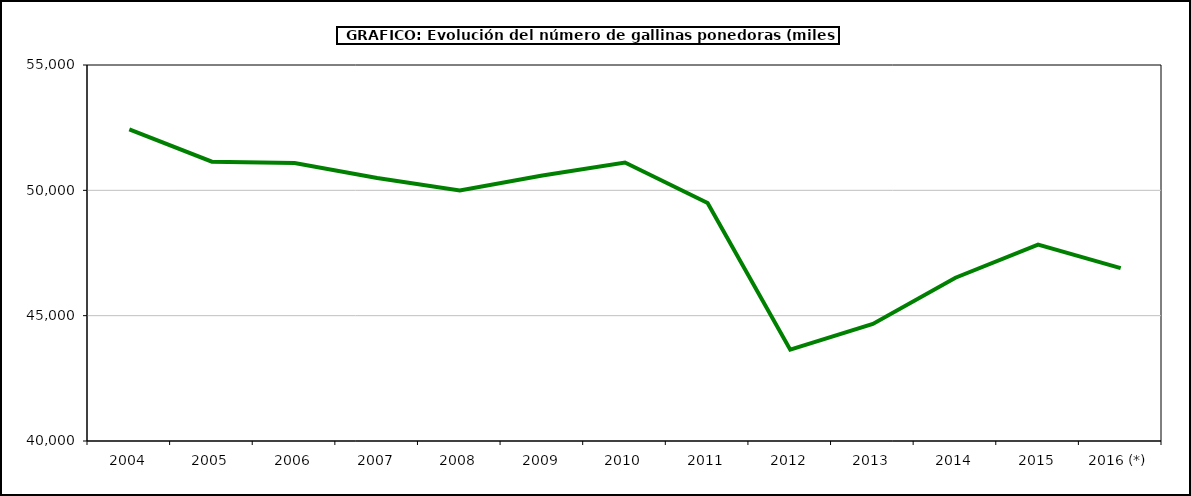
| Category | Huevos gallina |
|---|---|
| 2004 | 52432.67 |
| 2005 | 51141.084 |
| 2006 | 51089.874 |
| 2007 | 50494.963 |
| 2008 | 49994.952 |
| 2009 | 50593.247 |
| 2010 | 51108 |
| 2011 | 49494.204 |
| 2012 | 43642.944 |
| 2013 | 44667.904 |
| 2014 | 46512.999 |
| 2015 | 47835.268 |
| 2016 (*) | 46894 |